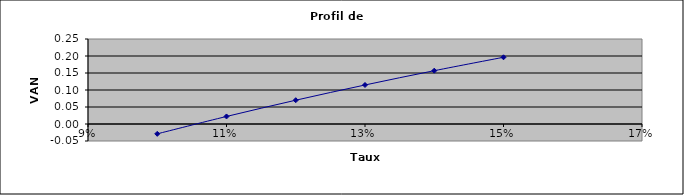
| Category | VAN |
|---|---|
| 0.1 | -0.029 |
| 0.11 | 0.022 |
| 0.12 | 0.07 |
| 0.13 | 0.115 |
| 0.14 | 0.157 |
| 0.15000000000000002 | 0.196 |